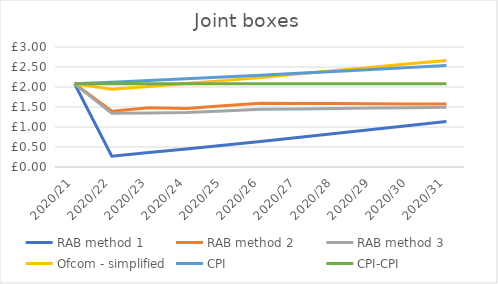
| Category | RAB method 1 | RAB method 2 | RAB method 3 | Ofcom - simplified | CPI | CPI-CPI |
|---|---|---|---|---|---|---|
| 2020/21 | 2.08 | 2.08 | 2.08 | 2.08 | 2.08 | 2.08 |
| 2020/22 | 0.272 | 1.395 | 1.341 | 1.945 | 2.122 | 2.08 |
| 2020/23 | 0.361 | 1.48 | 1.347 | 2.016 | 2.164 | 2.08 |
| 2020/24 | 0.45 | 1.465 | 1.362 | 2.086 | 2.207 | 2.08 |
| 2020/25 | 0.542 | 1.534 | 1.399 | 2.159 | 2.251 | 2.08 |
| 2020/26 | 0.639 | 1.594 | 1.441 | 2.237 | 2.296 | 2.08 |
| 2020/27 | 0.739 | 1.59 | 1.451 | 2.324 | 2.342 | 2.08 |
| 2020/28 | 0.839 | 1.586 | 1.462 | 2.41 | 2.389 | 2.08 |
| 2020/29 | 0.938 | 1.582 | 1.473 | 2.495 | 2.437 | 2.08 |
| 2020/30 | 1.037 | 1.578 | 1.484 | 2.579 | 2.486 | 2.08 |
| 2020/31 | 1.135 | 1.574 | 1.495 | 2.663 | 2.536 | 2.08 |